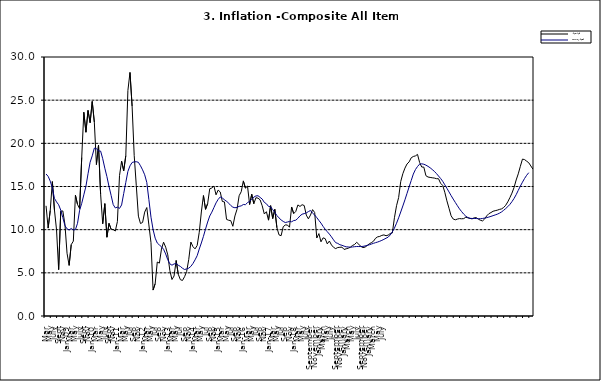
| Category | Year-on Rate | 12-Month Average |
|---|---|---|
| Jan-09 | 14.034 | 12.032 |
| Feb | 14.584 | 12.567 |
| Mar | 14.366 | 13.101 |
| Apr | 13.268 | 13.51 |
| May | 13.212 | 13.787 |
| June | 11.194 | 13.694 |
| July | 11.09 | 13.437 |
| Aug | 11.046 | 13.307 |
| Sept | 10.39 | 13.065 |
| Oct | 11.588 | 12.803 |
| Nov | 12.368 | 12.609 |
| Dec | 13.93 | 12.538 |
| Jan-10 | 14.398 | 12.586 |
| Feb | 15.649 | 12.7 |
| Mar | 14.812 | 12.757 |
| Apr | 15.044 | 12.915 |
| May | 12.915 | 12.893 |
| June | 14.099 | 13.132 |
| July | 13.002 | 13.284 |
| Aug | 13.702 | 13.5 |
| Sept | 13.65 | 13.764 |
| Oct | 13.45 | 13.908 |
| Nov | 12.766 | 13.928 |
| Dec | 11.815 | 13.74 |
| Jan-11 | 12.08 | 13.542 |
| Feb | 11.1 | 13.161 |
| Mar | 12.779 | 13.001 |
| Apr | 11.291 | 12.694 |
| May | 12.352 | 12.648 |
| Jun | 10.23 | 12.321 |
| Jul | 9.397 | 12.009 |
| Aug | 9.301 | 11.635 |
| Sep | 10.339 | 11.363 |
| Oct | 10.544 | 11.13 |
| Nov | 10.54 | 10.952 |
| Dec | 10.283 | 10.826 |
| Jan-12 | 12.626 | 10.886 |
| Feb | 11.866 | 10.955 |
| Mar | 12.111 | 10.914 |
| Apr | 12.866 | 11.054 |
| May | 12.688 | 11.096 |
| Jun | 12.892 | 11.32 |
| Jul | 12.797 | 11.599 |
| Aug | 11.689 | 11.791 |
| Sep | 11.253 | 11.859 |
| Oct | 11.693 | 11.948 |
| Nov | 12.32 | 12.091 |
| Dec | 11.981 | 12.224 |
| Jan-13 | 9.031 | 11.908 |
| Feb | 9.542 | 11.703 |
| Mar | 8.593 | 11.394 |
| Apr | 9.052 | 11.072 |
| May | 8.964 | 10.761 |
| Jun | 8.353 | 10.383 |
| Jul | 8.682 | 10.047 |
| Aug | 8.231 | 9.761 |
| Sep | 7.952 | 9.486 |
| Oct | 7.807 | 9.167 |
| Nov | 7.931 | 8.815 |
| Dec | 7.957 | 8.496 |
| Jan-14 | 7.977 | 8.408 |
| Feb | 7.707 | 8.257 |
| Mar | 7.783 | 8.19 |
| Apr | 7.851 | 8.092 |
| May | 7.965 | 8.012 |
| Jun | 8.167 | 7.998 |
| Jul | 8.281 | 7.968 |
| Aug | 8.534 | 7.996 |
| Sep | 8.317 | 8.027 |
| Oct | 8.06 | 8.047 |
| Nov | 7.927 | 8.046 |
| Dec | 7.978 | 8.047 |
| Jan-15 | 8.157 | 8.063 |
| Feb | 8.359 | 8.117 |
| Mar | 8.494 | 8.176 |
| Apr | 8.655 | 8.243 |
| May | 9.003 | 8.331 |
| Jun | 9.168 | 8.417 |
| Jul | 9.218 | 8.497 |
| Aug | 9.336 | 8.566 |
| Sep | 9.394 | 8.658 |
| Oct | 9.296 | 8.76 |
| Nov | 9.368 | 8.879 |
| Dec | 9.554 | 9.009 |
| Jan-16 | 9.617 | 9.13 |
| Feb | 11.379 | 9.386 |
| Mar | 12.775 | 9.751 |
| Apr | 13.721 | 10.182 |
| May | 15.577 | 10.746 |
| Jun | 16.48 | 11.372 |
| Jul | 17.127 | 12.045 |
| Aug | 17.609 | 12.744 |
| Sep | 17.852 | 13.454 |
| Oct | 18.33 | 14.206 |
| Nov | 18.476 | 14.958 |
| Dec | 18.547 | 15.697 |
| Jan-17 | 18.719 | 16.441 |
| Feb | 17.78 | 16.958 |
| Mar | 17.256 | 17.315 |
| Apr | 17.244 | 17.591 |
| May | 16.251 | 17.628 |
| Jun | 16.098 | 17.578 |
| Jul | 16.053 | 17.475 |
| Aug | 16.012 | 17.331 |
| Sep | 15.979 | 17.17 |
| Oct | 15.905 | 16.968 |
| Nov | 15.901 | 16.76 |
| Dec | 15.372 | 16.502 |
| Jan-18 | 15.127 | 16.215 |
| Feb | 14.33 | 15.93 |
| Mar | 13.337 | 15.599 |
| Apr | 12.482 | 15.196 |
| May | 11.608 | 14.793 |
| June | 11.231 | 14.371 |
| July | 11.142 | 13.95 |
| August | 11.227 | 13.546 |
| September | 11.284 | 13.157 |
| October | 11.259 | 12.777 |
| November | 11.281 | 12.406 |
| December | 11.442 | 12.095 |
| January | 11.374 | 11.801 |
| February | 11.306 | 11.564 |
| March | 11.251 | 11.401 |
| April | 11.372 | 11.314 |
| May | 11.396 | 11.299 |
| June | 11.217 | 11.297 |
| July | 11.084 | 11.291 |
| August | 11.016 | 11.271 |
| September | 11.244 | 11.268 |
| October | 11.607 | 11.298 |
| November | 11.854 | 11.348 |
| December | 11.982 | 11.396 |
| January | 12.132 | 11.462 |
| February | 12.199 | 11.539 |
| March | 12.257 | 11.624 |
| April | 12.341 | 11.706 |
| May | 12.404 | 11.791 |
| June | 12.559 | 11.904 |
| July | 12.821 | 12.049 |
| August | 13.22 | 12.233 |
| September | 13.707 | 12.44 |
| October | 14.233 | 12.664 |
| November | 14.887 | 12.923 |
| December | 15.753 | 13.246 |
| January | 16.466 | 13.616 |
| February | 17.335 | 14.053 |
| March | 18.171 | 14.554 |
| April | 18.117 | 15.039 |
| May | 17.933 | 15.499 |
| June | 17.751 | 15.927 |
| July | 17.377 | 16.298 |
| August | 17.009 | 16.601 |